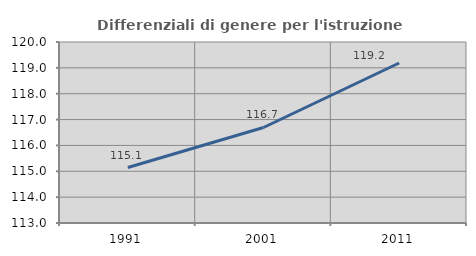
| Category | Differenziali di genere per l'istruzione superiore |
|---|---|
| 1991.0 | 115.144 |
| 2001.0 | 116.694 |
| 2011.0 | 119.188 |